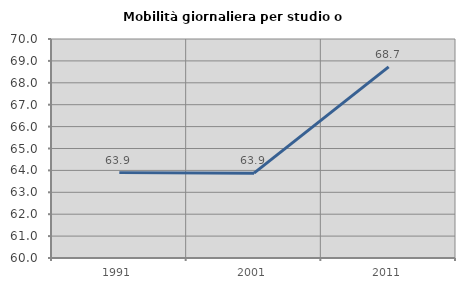
| Category | Mobilità giornaliera per studio o lavoro |
|---|---|
| 1991.0 | 63.898 |
| 2001.0 | 63.873 |
| 2011.0 | 68.728 |